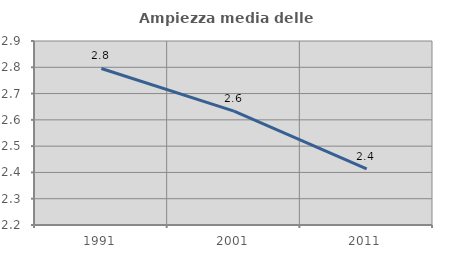
| Category | Ampiezza media delle famiglie |
|---|---|
| 1991.0 | 2.795 |
| 2001.0 | 2.633 |
| 2011.0 | 2.413 |